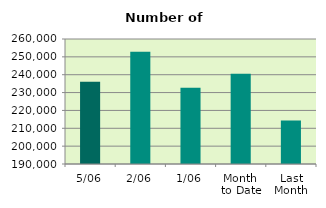
| Category | Series 0 |
|---|---|
| 5/06 | 236038 |
| 2/06 | 252854 |
| 1/06 | 232682 |
| Month 
to Date | 240524.667 |
| Last
Month | 214383.182 |